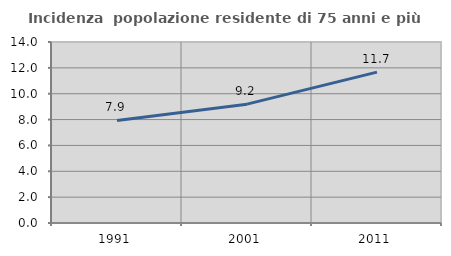
| Category | Incidenza  popolazione residente di 75 anni e più |
|---|---|
| 1991.0 | 7.931 |
| 2001.0 | 9.194 |
| 2011.0 | 11.673 |